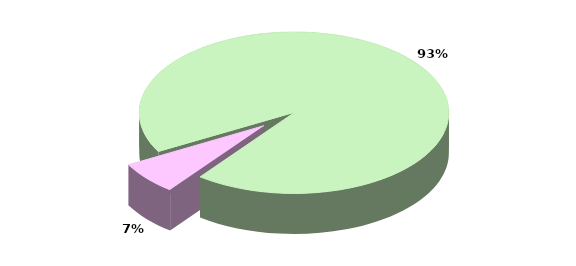
| Category | Series 0 |
|---|---|
| TOTALE ENTRATE CORRENTI | 23923.154 |
| TOTALE ENTRATE IN CONTO CAPITALE | 1681.556 |